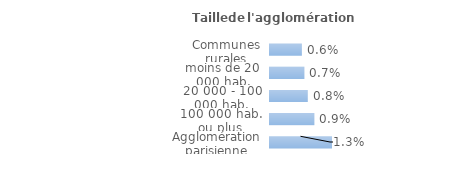
| Category | Series 0 |
|---|---|
| Communes rurales | 0.006 |
| moins de 20 000 hab. | 0.007 |
| 20 000 - 100 000 hab. | 0.008 |
| 100 000 hab. ou plus | 0.009 |
| Agglomération parisienne | 0.013 |